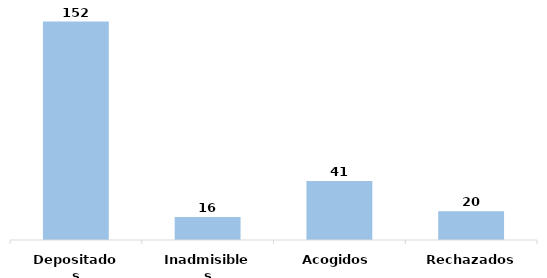
| Category | Series 0 |
|---|---|
| Depositados | 152 |
| Inadmisibles | 16 |
| Acogidos | 41 |
| Rechazados | 20 |